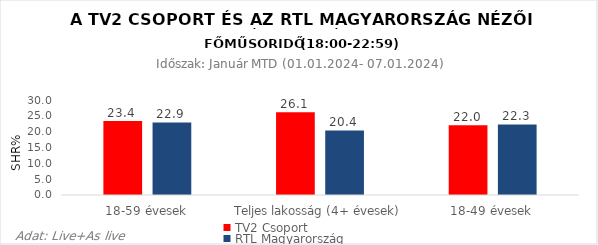
| Category | TV2 Csoport | RTL Magyarország |
|---|---|---|
| 18-59 évesek | 23.4 | 22.9 |
| Teljes lakosság (4+ évesek) | 26.1 | 20.4 |
| 18-49 évesek | 22 | 22.3 |